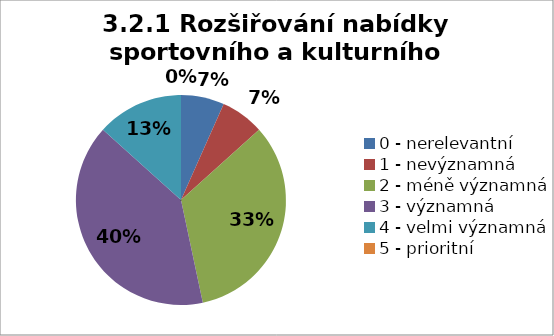
| Category | Series 4 | Series 3 | Series 2 | Series 1 | Series 0 |
|---|---|---|---|---|---|
| 0 - nerelevantní | 6.667 | 0 | 0 | 0 | 0 |
| 1 - nevýznamná | 6.667 | 0 | 6.667 | 0 | 0 |
| 2 - méně významná | 33.333 | 26.667 | 0 | 6.667 | 0 |
| 3 - významná | 40 | 46.667 | 53.333 | 46.667 | 33.333 |
| 4 - velmi významná | 13.333 | 13.333 | 40 | 33.333 | 40 |
| 5 - prioritní | 0 | 13.333 | 0 | 13.333 | 26.667 |